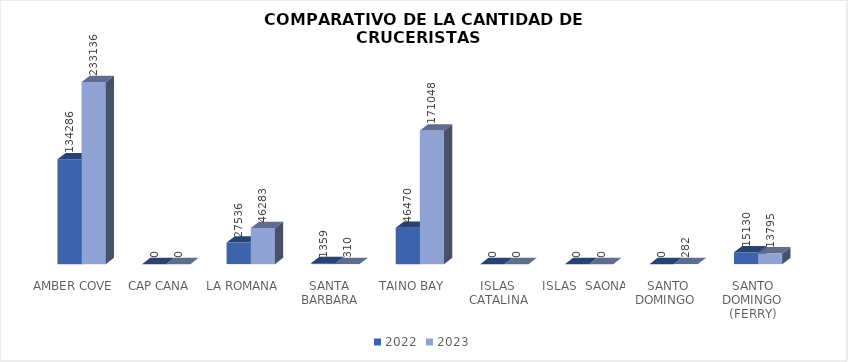
| Category | 2022 | 2023 |
|---|---|---|
| AMBER COVE | 134286 | 233136 |
| CAP CANA | 0 | 0 |
| LA ROMANA | 27536 | 46283 |
| SANTA BARBARA | 1359 | 310 |
| TAINO BAY | 46470 | 171048 |
| ISLAS  CATALINA | 0 | 0 |
| ISLAS  SAONA | 0 | 0 |
| SANTO DOMINGO  | 0 | 282 |
| SANTO DOMINGO (FERRY) | 15130 | 13795 |